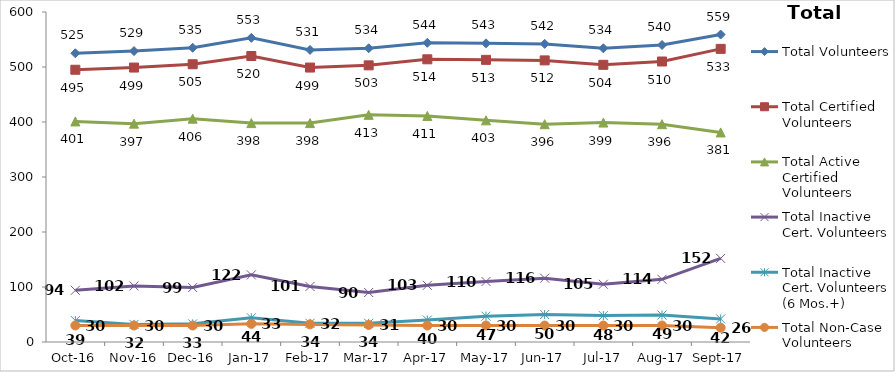
| Category | Total Volunteers | Total Certified Volunteers | Total Active Certified Volunteers | Total Inactive Cert. Volunteers | Total Inactive Cert. Volunteers (6 Mos.+) | Total Non-Case Volunteers |
|---|---|---|---|---|---|---|
| 2016-10-01 | 525 | 495 | 401 | 94 | 39 | 30 |
| 2016-11-01 | 529 | 499 | 397 | 102 | 32 | 30 |
| 2016-12-01 | 535 | 505 | 406 | 99 | 33 | 30 |
| 2017-01-01 | 553 | 520 | 398 | 122 | 44 | 33 |
| 2017-02-01 | 531 | 499 | 398 | 101 | 34 | 32 |
| 2017-03-01 | 534 | 503 | 413 | 90 | 34 | 31 |
| 2017-04-01 | 544 | 514 | 411 | 103 | 40 | 30 |
| 2017-05-01 | 543 | 513 | 403 | 110 | 47 | 30 |
| 2017-06-01 | 542 | 512 | 396 | 116 | 50 | 30 |
| 2017-07-01 | 534 | 504 | 399 | 105 | 48 | 30 |
| 2017-08-01 | 540 | 510 | 396 | 114 | 49 | 30 |
| 2017-09-01 | 559 | 533 | 381 | 152 | 42 | 26 |